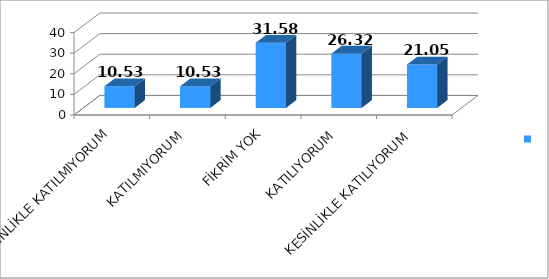
| Category | Series 0 |
|---|---|
| KESİNLİKLE KATILMIYORUM | 10.53 |
| KATILMIYORUM | 10.53 |
| FİKRİM YOK | 31.58 |
| KATILIYORUM | 26.32 |
| KESİNLİKLE KATILIYORUM | 21.05 |